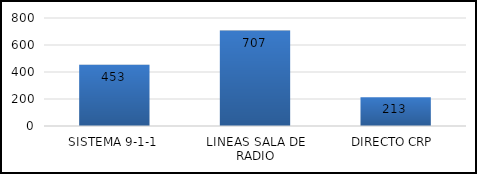
| Category | TOTAL |
|---|---|
| SISTEMA 9-1-1 | 453 |
| LINEAS SALA DE RADIO | 707 |
| DIRECTO CRP  | 213 |